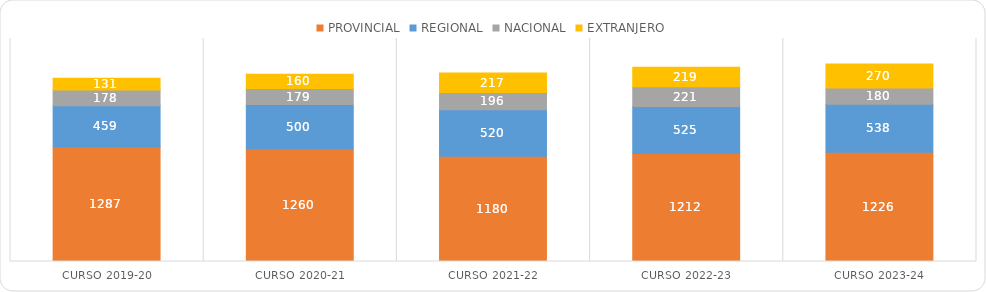
| Category | PROVINCIAL | REGIONAL | NACIONAL | EXTRANJERO |
|---|---|---|---|---|
| Curso 2019-20 | 1287 | 459 | 178 | 131 |
| Curso 2020-21 | 1260 | 500 | 179 | 160 |
| Curso 2021-22 | 1180 | 520 | 196 | 217 |
| Curso 2022-23 | 1212 | 525 | 221 | 219 |
| Curso 2023-24 | 1226 | 538 | 180 | 270 |